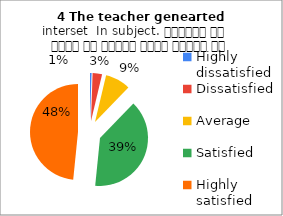
| Category | 4 The teacher genearted interset  In subject. शिक्षक ने विषय के प्रति रुचि जागृत की |
|---|---|
| Highly dissatisfied | 1 |
| Dissatisfied | 6 |
| Average | 16 |
| Satisfied | 74 |
| Highly satisfied | 91 |